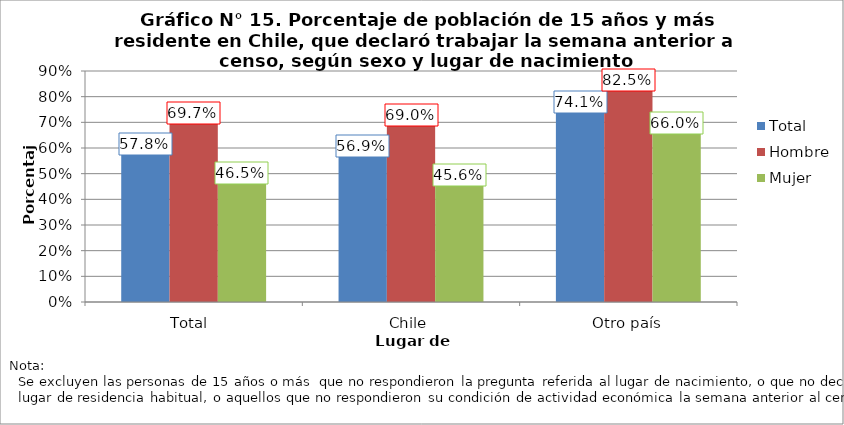
| Category | Total | Hombre | Mujer |
|---|---|---|---|
| Total  | 0.578 | 0.697 | 0.465 |
| Chile | 0.569 | 0.69 | 0.456 |
| Otro país | 0.741 | 0.825 | 0.66 |